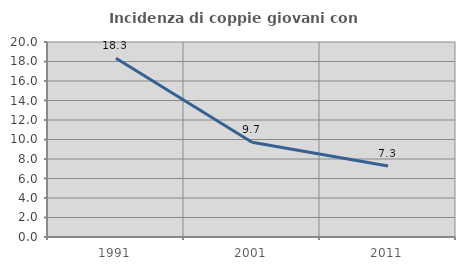
| Category | Incidenza di coppie giovani con figli |
|---|---|
| 1991.0 | 18.324 |
| 2001.0 | 9.721 |
| 2011.0 | 7.286 |